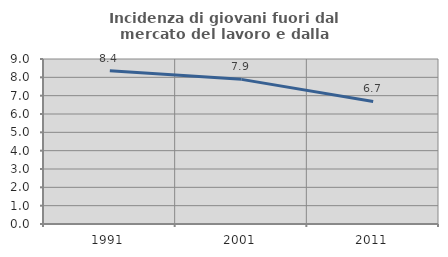
| Category | Incidenza di giovani fuori dal mercato del lavoro e dalla formazione  |
|---|---|
| 1991.0 | 8.363 |
| 2001.0 | 7.889 |
| 2011.0 | 6.682 |